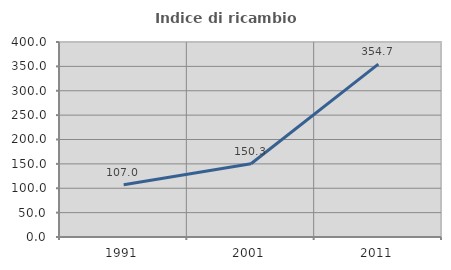
| Category | Indice di ricambio occupazionale  |
|---|---|
| 1991.0 | 107.042 |
| 2001.0 | 150.311 |
| 2011.0 | 354.724 |